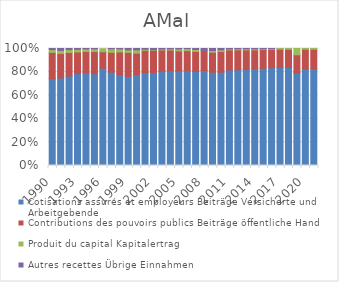
| Category | Cotisations assurés et employeurs | Contributions des pouvoirs publics | Produit du capital | Autres recettes |
|---|---|---|---|---|
| 1990.0 | 0.742 | 0.224 | 0.024 | 0.009 |
| 1991.0 | 0.748 | 0.209 | 0.026 | 0.016 |
| 1992.0 | 0.765 | 0.201 | 0.025 | 0.009 |
| 1993.0 | 0.785 | 0.185 | 0.023 | 0.007 |
| 1994.0 | 0.792 | 0.182 | 0.022 | 0.004 |
| 1995.0 | 0.783 | 0.191 | 0.023 | 0.003 |
| 1996.0 | 0.835 | 0.141 | 0.026 | -0.002 |
| 1997.0 | 0.798 | 0.169 | 0.03 | 0.003 |
| 1998.0 | 0.776 | 0.195 | 0.027 | 0.003 |
| 1999.0 | 0.762 | 0.204 | 0.023 | 0.011 |
| 2000.0 | 0.775 | 0.185 | 0.028 | 0.011 |
| 2001.0 | 0.794 | 0.189 | 0.01 | 0.007 |
| 2002.0 | 0.795 | 0.188 | 0.005 | 0.012 |
| 2003.0 | 0.805 | 0.182 | 0.009 | 0.004 |
| 2004.0 | 0.812 | 0.175 | 0.011 | 0.003 |
| 2005.0 | 0.809 | 0.171 | 0.017 | 0.003 |
| 2006.0 | 0.812 | 0.17 | 0.017 | 0.001 |
| 2007.0 | 0.805 | 0.17 | 0.017 | 0.008 |
| 2008.0 | 0.812 | 0.171 | 0.001 | 0.016 |
| 2009.0 | 0.797 | 0.172 | 0.014 | 0.017 |
| 2010.0 | 0.797 | 0.177 | 0.014 | 0.011 |
| 2011.0 | 0.817 | 0.171 | 0.008 | 0.004 |
| 2012.0 | 0.818 | 0.171 | 0.01 | 0.002 |
| 2013.0 | 0.821 | 0.167 | 0.01 | 0.002 |
| 2014.0 | 0.826 | 0.162 | 0.009 | 0.003 |
| 2015.0 | 0.831 | 0.159 | 0.007 | 0.002 |
| 2016.0 | 0.836 | 0.156 | 0.007 | 0.001 |
| 2017.0 | 0.84 | 0.154 | 0.006 | 0 |
| 2018.0 | 0.838 | 0.155 | 0.006 | 0 |
| 2019.0 | 0.793 | 0.153 | 0.054 | 0 |
| 2020.0 | 0.826 | 0.167 | 0.006 | 0 |
| 2021.0 | 0.828 | 0.166 | 0.007 | 0 |